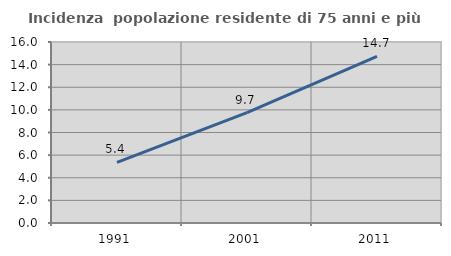
| Category | Incidenza  popolazione residente di 75 anni e più |
|---|---|
| 1991.0 | 5.351 |
| 2001.0 | 9.749 |
| 2011.0 | 14.728 |